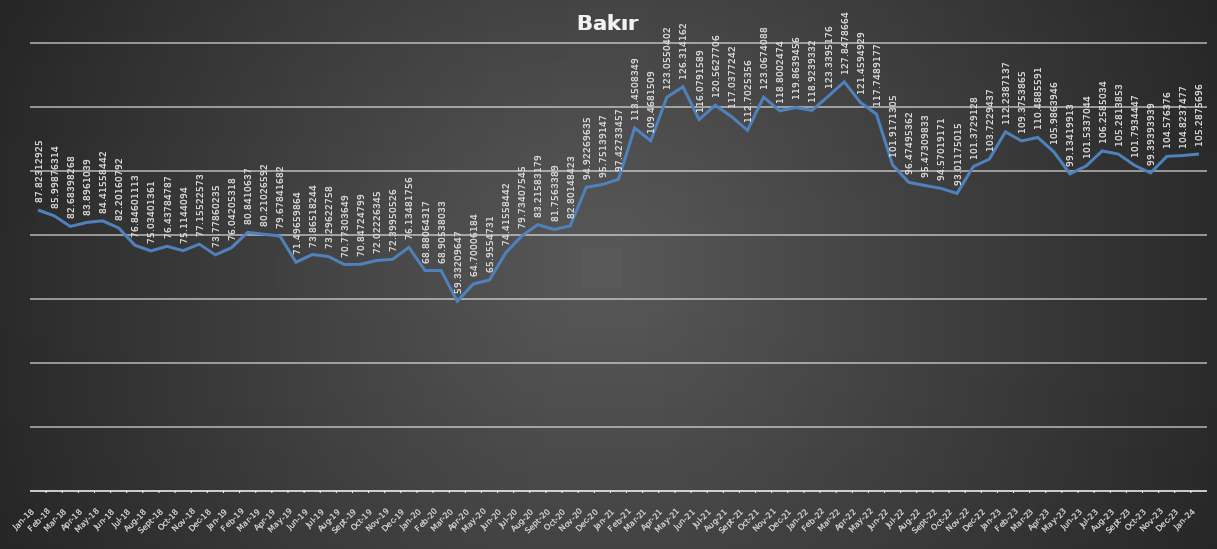
| Category | Series 0 |
|---|---|
| 2018-01-31 | 87.823 |
| 2018-02-28 | 85.999 |
| 2018-03-31 | 82.684 |
| 2018-04-30 | 83.896 |
| 2018-05-31 | 84.416 |
| 2018-06-30 | 82.202 |
| 2018-07-31 | 76.846 |
| 2018-08-31 | 75.034 |
| 2018-09-30 | 76.438 |
| 2018-10-31 | 75.114 |
| 2018-11-30 | 77.155 |
| 2018-12-31 | 73.779 |
| 2019-01-31 | 76.042 |
| 2019-02-28 | 80.841 |
| 2019-03-31 | 80.21 |
| 2019-04-30 | 79.678 |
| 2019-05-31 | 71.497 |
| 2019-06-30 | 73.865 |
| 2019-07-31 | 73.296 |
| 2019-08-31 | 70.773 |
| 2019-09-30 | 70.847 |
| 2019-10-31 | 72.022 |
| 2019-11-30 | 72.4 |
| 2019-12-31 | 76.135 |
| 2020-01-31 | 68.881 |
| 2020-02-29 | 68.905 |
| 2020-03-31 | 59.332 |
| 2020-04-30 | 64.7 |
| 2020-05-31 | 65.955 |
| 2020-06-30 | 74.416 |
| 2020-07-31 | 79.734 |
| 2020-08-31 | 83.216 |
| 2020-09-30 | 81.756 |
| 2020-10-31 | 82.801 |
| 2020-11-30 | 94.923 |
| 2020-12-31 | 95.751 |
| 2021-01-31 | 97.427 |
| 2021-02-28 | 113.451 |
| 2021-03-31 | 109.468 |
| 2021-04-30 | 123.055 |
| 2021-05-31 | 126.314 |
| 2021-06-30 | 116.079 |
| 2021-07-31 | 120.563 |
| 2021-08-31 | 117.038 |
| 2021-09-30 | 112.703 |
| 2021-10-31 | 123.067 |
| 2021-11-30 | 118.8 |
| 2021-12-31 | 119.864 |
| 2022-01-31 | 118.924 |
| 2022-02-28 | 123.34 |
| 2022-03-31 | 127.848 |
| 2022-04-30 | 121.459 |
| 2022-05-31 | 117.749 |
| 2022-06-30 | 101.917 |
| 2022-07-31 | 96.475 |
| 2022-08-31 | 95.473 |
| 2022-09-30 | 94.57 |
| 2022-10-31 | 93.012 |
| 2022-11-30 | 101.373 |
| 2022-12-31 | 103.723 |
| 2023-01-31 | 112.239 |
| 2023-02-28 | 109.375 |
| 2023-03-31 | 110.489 |
| 2023-04-30 | 105.986 |
| 2023-05-31 | 99.134 |
| 2023-06-30 | 101.534 |
| 2023-07-31 | 106.259 |
| 2023-08-31 | 105.281 |
| 2023-09-30 | 101.793 |
| 2023-10-31 | 99.394 |
| 2023-11-30 | 104.576 |
| 2023-12-31 | 104.824 |
| 2024-01-31 | 105.288 |